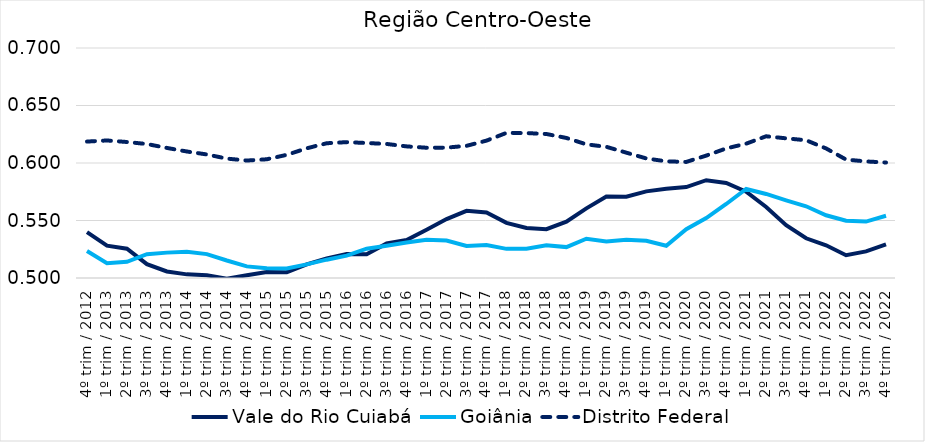
| Category | Vale do Rio Cuiabá | Goiânia | Distrito Federal |
|---|---|---|---|
| 4º trim / 2012 | 0.54 | 0.523 | 0.619 |
| 1º trim / 2013 | 0.528 | 0.513 | 0.62 |
| 2º trim / 2013 | 0.525 | 0.514 | 0.618 |
| 3º trim / 2013 | 0.512 | 0.521 | 0.616 |
| 4º trim / 2013 | 0.506 | 0.522 | 0.613 |
| 1º trim / 2014 | 0.503 | 0.523 | 0.61 |
| 2º trim / 2014 | 0.502 | 0.521 | 0.607 |
| 3º trim / 2014 | 0.499 | 0.515 | 0.604 |
| 4º trim / 2014 | 0.502 | 0.51 | 0.602 |
| 1º trim / 2015 | 0.505 | 0.508 | 0.603 |
| 2º trim / 2015 | 0.505 | 0.508 | 0.607 |
| 3º trim / 2015 | 0.512 | 0.512 | 0.613 |
| 4º trim / 2015 | 0.517 | 0.516 | 0.617 |
| 1º trim / 2016 | 0.521 | 0.519 | 0.618 |
| 2º trim / 2016 | 0.521 | 0.525 | 0.617 |
| 3º trim / 2016 | 0.53 | 0.528 | 0.617 |
| 4º trim / 2016 | 0.533 | 0.531 | 0.614 |
| 1º trim / 2017 | 0.542 | 0.533 | 0.613 |
| 2º trim / 2017 | 0.551 | 0.533 | 0.613 |
| 3º trim / 2017 | 0.558 | 0.528 | 0.615 |
| 4º trim / 2017 | 0.557 | 0.529 | 0.619 |
| 1º trim / 2018 | 0.548 | 0.525 | 0.626 |
| 2º trim / 2018 | 0.544 | 0.525 | 0.626 |
| 3º trim / 2018 | 0.542 | 0.528 | 0.625 |
| 4º trim / 2018 | 0.549 | 0.527 | 0.622 |
| 1º trim / 2019 | 0.561 | 0.534 | 0.616 |
| 2º trim / 2019 | 0.571 | 0.532 | 0.614 |
| 3º trim / 2019 | 0.571 | 0.533 | 0.609 |
| 4º trim / 2019 | 0.575 | 0.532 | 0.604 |
| 1º trim / 2020 | 0.578 | 0.528 | 0.601 |
| 2º trim / 2020 | 0.579 | 0.542 | 0.601 |
| 3º trim / 2020 | 0.585 | 0.552 | 0.606 |
| 4º trim / 2020 | 0.583 | 0.564 | 0.613 |
| 1º trim / 2021 | 0.575 | 0.577 | 0.617 |
| 2º trim / 2021 | 0.562 | 0.573 | 0.623 |
| 3º trim / 2021 | 0.546 | 0.568 | 0.621 |
| 4º trim / 2021 | 0.535 | 0.562 | 0.62 |
| 1º trim / 2022 | 0.528 | 0.555 | 0.613 |
| 2º trim / 2022 | 0.52 | 0.55 | 0.603 |
| 3º trim / 2022 | 0.523 | 0.549 | 0.601 |
| 4º trim / 2022 | 0.529 | 0.554 | 0.6 |